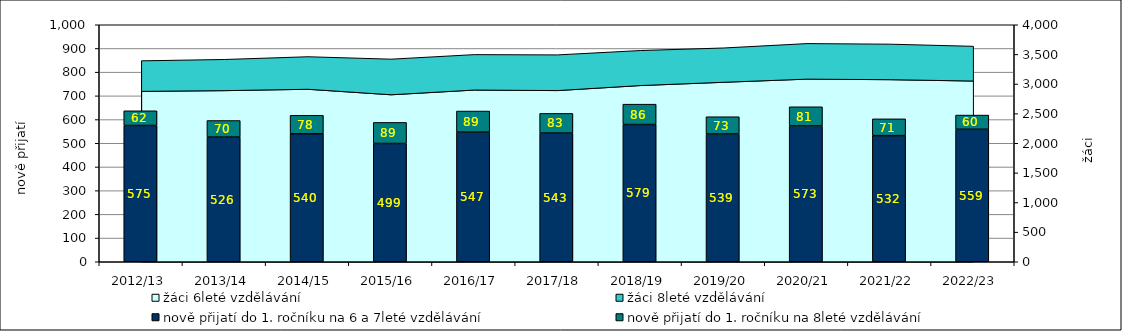
| Category | nově přijatí do 1. ročníku na 6 a 7leté vzdělávání | nově přijatí do 1. ročníku na 8leté vzdělávání |
|---|---|---|
| 2012/13 | 575 | 62 |
| 2013/14 | 526 | 70 |
| 2014/15 | 540 | 78 |
| 2015/16 | 499 | 89 |
| 2016/17 | 547 | 89 |
| 2017/18 | 543 | 83 |
| 2018/19 | 579 | 86 |
| 2019/20 | 539 | 73 |
| 2020/21 | 573 | 81 |
| 2021/22 | 532 | 71 |
| 2022/23 | 559 | 60 |